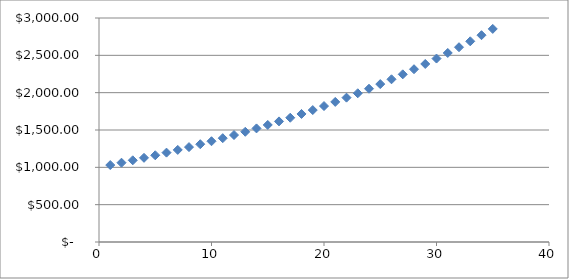
| Category | Series 0 |
|---|---|
| 1.0 | 1030.416 |
| 2.0 | 1061.757 |
| 3.0 | 1094.051 |
| 4.0 | 1127.328 |
| 5.0 | 1161.617 |
| 6.0 | 1196.948 |
| 7.0 | 1233.355 |
| 8.0 | 1270.868 |
| 9.0 | 1309.523 |
| 10.0 | 1349.354 |
| 11.0 | 1390.395 |
| 12.0 | 1432.686 |
| 13.0 | 1476.262 |
| 14.0 | 1521.164 |
| 15.0 | 1567.432 |
| 16.0 | 1615.107 |
| 17.0 | 1664.232 |
| 18.0 | 1714.851 |
| 19.0 | 1767.01 |
| 20.0 | 1820.755 |
| 21.0 | 1876.135 |
| 22.0 | 1933.199 |
| 23.0 | 1992 |
| 24.0 | 2052.588 |
| 25.0 | 2115.02 |
| 26.0 | 2179.35 |
| 27.0 | 2245.637 |
| 28.0 | 2313.94 |
| 29.0 | 2384.321 |
| 30.0 | 2456.842 |
| 31.0 | 2531.569 |
| 32.0 | 2608.57 |
| 33.0 | 2687.912 |
| 34.0 | 2769.667 |
| 35.0 | 2853.909 |